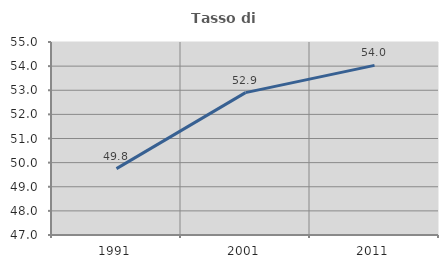
| Category | Tasso di occupazione   |
|---|---|
| 1991.0 | 49.751 |
| 2001.0 | 52.901 |
| 2011.0 | 54.031 |